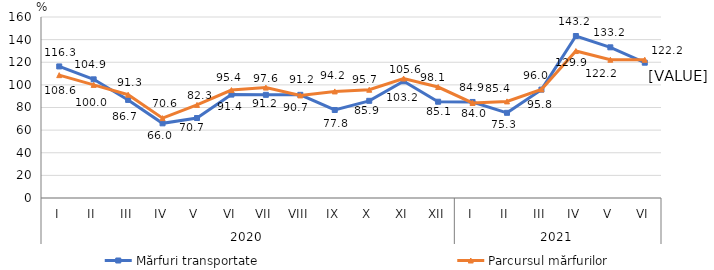
| Category | Mărfuri transportate | Parcursul mărfurilor |
|---|---|---|
| 0 | 116.3 | 108.6 |
| 1 | 104.9 | 100 |
| 2 | 86.7 | 91.3 |
| 3 | 66 | 70.6 |
| 4 | 70.7 | 82.3 |
| 5 | 91.4 | 95.4 |
| 6 | 91.2 | 97.6 |
| 7 | 91.2 | 90.7 |
| 8 | 77.8 | 94.2 |
| 9 | 85.9 | 95.7 |
| 10 | 103.2 | 105.6 |
| 11 | 85.1 | 98.1 |
| 12 | 84.9 | 84 |
| 13 | 75.3 | 85.4 |
| 14 | 95.8 | 96 |
| 15 | 143.2 | 129.9 |
| 16 | 133.2 | 122.2 |
| 17 | 119.6 | 122.2 |